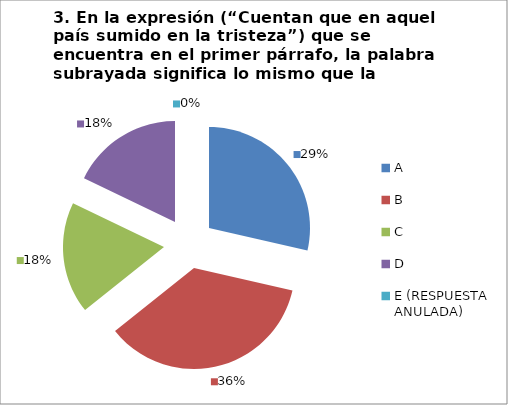
| Category | CANTIDAD DE RESPUESTAS PREGUNTA (3) | PORCENTAJE |
|---|---|---|
| A | 8 | 0.286 |
| B | 10 | 0.357 |
| C | 5 | 0.179 |
| D | 5 | 0.179 |
| E (RESPUESTA ANULADA) | 0 | 0 |